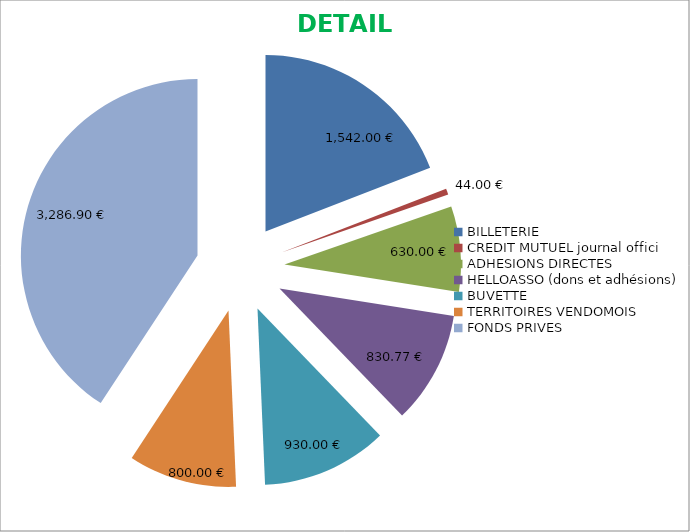
| Category | Series 0 |
|---|---|
| BILLETERIE | 1542 |
| CREDIT MUTUEL journal offici | 44 |
| ADHESIONS DIRECTES | 630 |
| HELLOASSO (dons et adhésions) | 830.77 |
| BUVETTE | 930 |
| TERRITOIRES VENDOMOIS | 800 |
| FONDS PRIVES | 3286.9 |